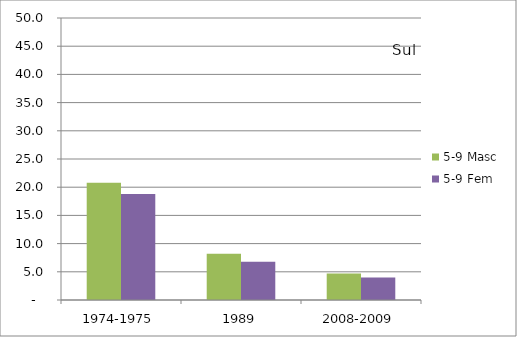
| Category | 5-9 Masc | 5-9 Fem |
|---|---|---|
| 1974-1975 | 20.8 | 18.8 |
| 1989 | 8.2 | 6.8 |
| 2008-2009 | 4.7 | 4 |